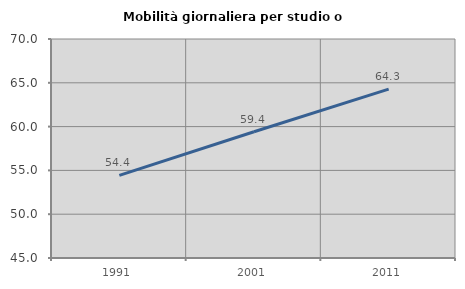
| Category | Mobilità giornaliera per studio o lavoro |
|---|---|
| 1991.0 | 54.427 |
| 2001.0 | 59.407 |
| 2011.0 | 64.274 |